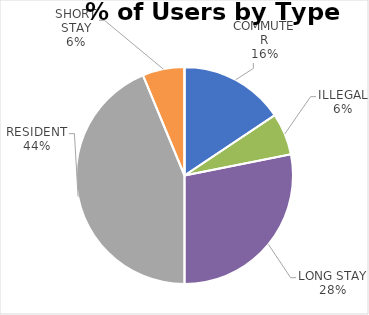
| Category | QUEEN'S ROAD |
|---|---|
| COMMUTER | 5 |
| ILLEGAL | 2 |
| LONG STAY | 9 |
| RESIDENT | 14 |
| SHORT STAY | 2 |
| DISABLED | 0 |
| OTHER | 0 |